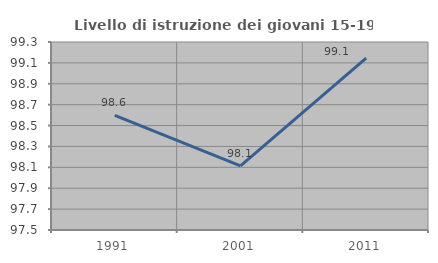
| Category | Livello di istruzione dei giovani 15-19 anni |
|---|---|
| 1991.0 | 98.598 |
| 2001.0 | 98.113 |
| 2011.0 | 99.145 |